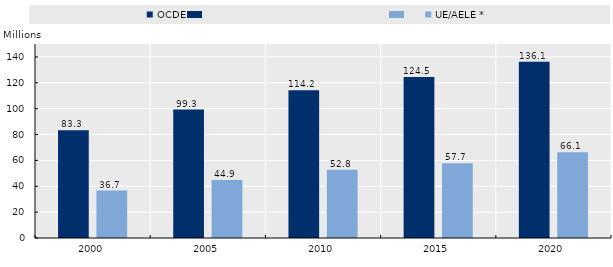
| Category | OCDE | UE/AELE * |
|---|---|---|
| 2000.0 | 83.304 | 36.708 |
| 2005.0 | 99.267 | 44.933 |
| 2010.0 | 114.245 | 52.776 |
| 2015.0 | 124.516 | 57.724 |
| 2020.0 | 136.231 | 66.232 |